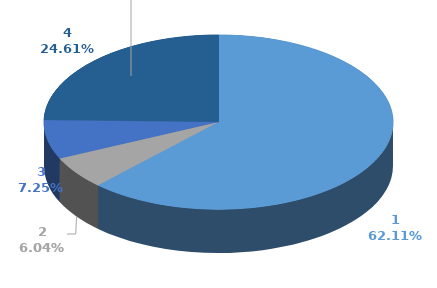
| Category | Series 0 | Series 1 |
|---|---|---|
| 0 | 1392945 |  |
| 1 | 135373 |  |
| 2 | 162500 |  |
| 3 | 551963 |  |